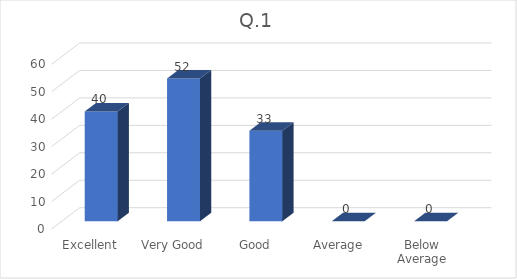
| Category | Series 0 |
|---|---|
| Excellent  | 40 |
| Very Good | 52 |
| Good | 33 |
| Average | 0 |
| Below Average | 0 |